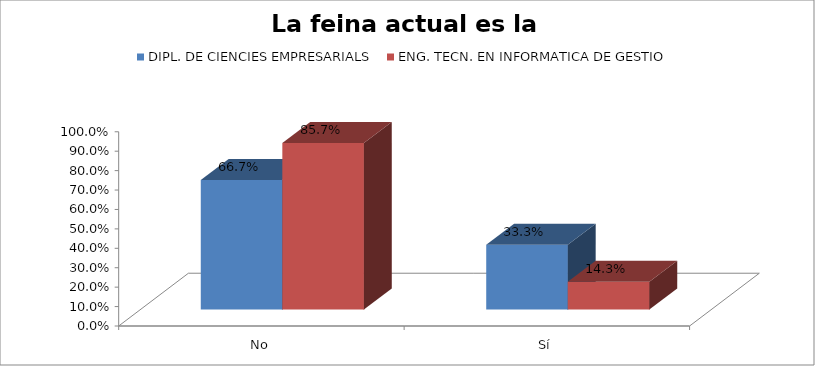
| Category | DIPL. DE CIENCIES EMPRESARIALS | ENG. TECN. EN INFORMATICA DE GESTIO |
|---|---|---|
| No | 0.667 | 0.857 |
| Sí | 0.333 | 0.143 |